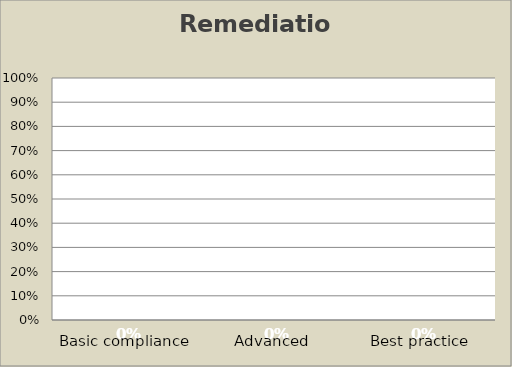
| Category | Remediation |
|---|---|
| Basic compliance | 0 |
| Advanced | 0 |
| Best practice | 0 |